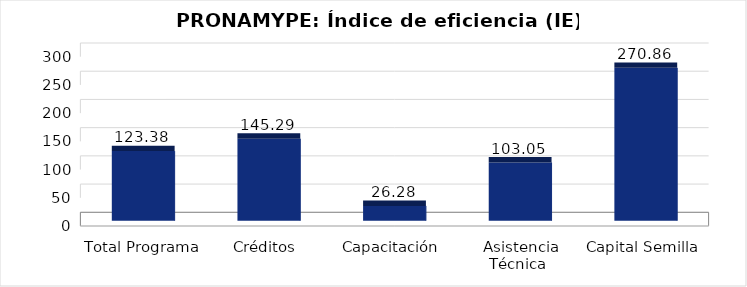
| Category | Índice de eficiencia (IE)  |
|---|---|
| Total Programa | 123.381 |
| Créditos  | 145.289 |
| Capacitación  | 26.281 |
| Asistencia Técnica  | 103.049 |
| Capital Semilla  | 270.857 |